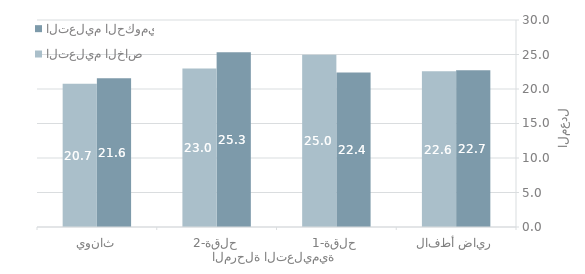
| Category | التعليم الحكومي | التعليم الخاص |
|---|---|---|
| رياض أطفال | 22.717 | 22.576 |
| حلقة-1 | 22.38 | 24.954 |
| حلقة-2 | 25.316 | 22.977 |
| ثانوي | 21.555 | 20.743 |